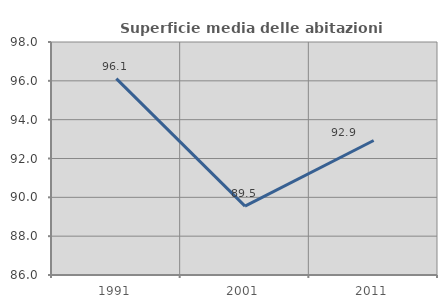
| Category | Superficie media delle abitazioni occupate |
|---|---|
| 1991.0 | 96.112 |
| 2001.0 | 89.549 |
| 2011.0 | 92.927 |